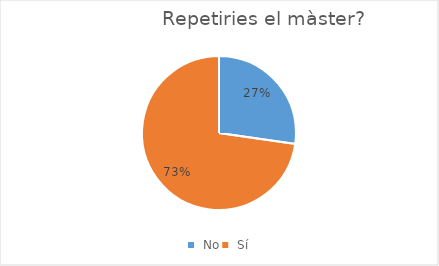
| Category | Series 0 |
|---|---|
|  No | 12 |
|  Sí | 32 |